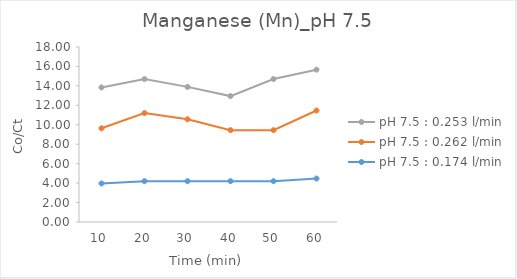
| Category | pH 7.5 : 0.174 l/min | pH 7.5 : 0.262 l/min | pH 7.5 : 0.253 l/min |
|---|---|---|---|
| 10.0 | 3.962 | 5.676 | 4.2 |
| 20.0 | 4.2 | 7 | 3.5 |
| 30.0 | 4.2 | 6.364 | 3.333 |
| 40.0 | 4.2 | 5.25 | 3.5 |
| 50.0 | 4.2 | 5.25 | 5.25 |
| 60.0 | 4.468 | 7 | 4.2 |